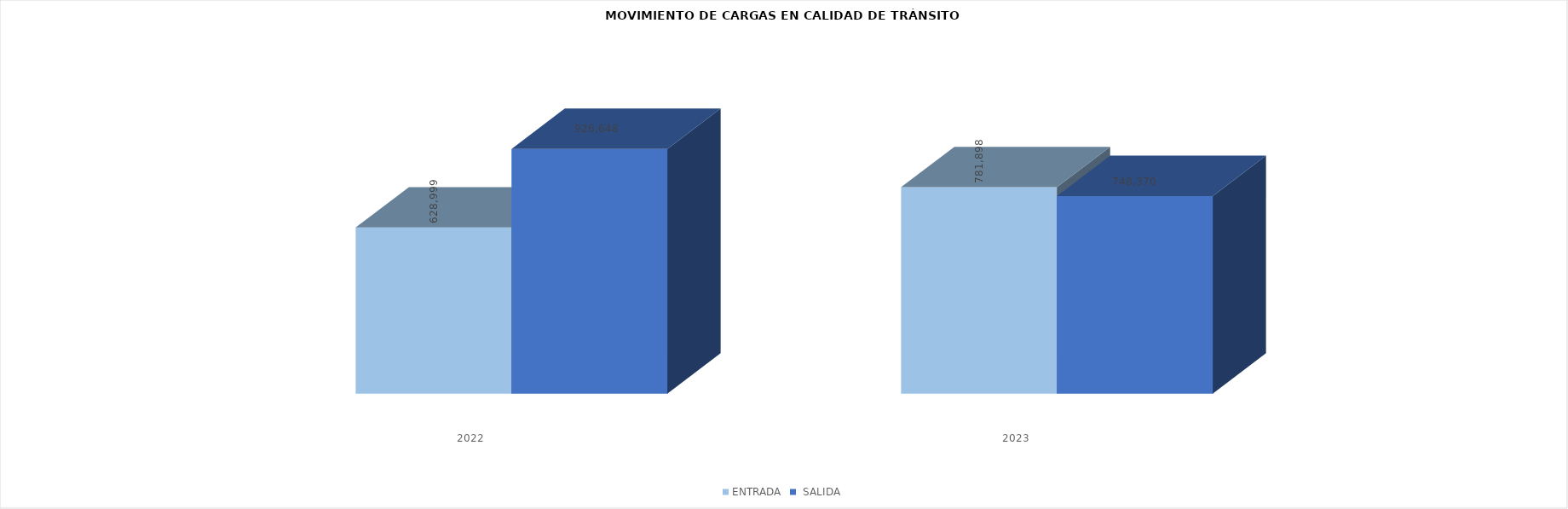
| Category | ENTRADA |  SALIDA |
|---|---|---|
| 2022.0 | 628999 | 926648 |
| 2023.0 | 781898 | 748370 |